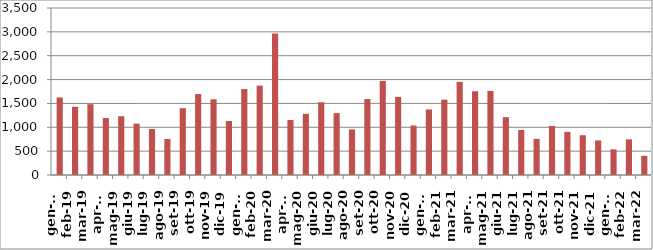
| Category | Series 0 |
|---|---|
| 2019-01-01 | 1625 |
| 2019-02-01 | 1430 |
| 2019-03-01 | 1484 |
| 2019-04-01 | 1196 |
| 2019-05-01 | 1232 |
| 2019-06-01 | 1076 |
| 2019-07-01 | 963 |
| 2019-08-01 | 755 |
| 2019-09-01 | 1400 |
| 2019-10-01 | 1697 |
| 2019-11-01 | 1587 |
| 2019-12-01 | 1131 |
| 2020-01-01 | 1801 |
| 2020-02-01 | 1874 |
| 2020-03-01 | 2963 |
| 2020-04-01 | 1154 |
| 2020-05-01 | 1282 |
| 2020-06-01 | 1525 |
| 2020-07-01 | 1297 |
| 2020-08-01 | 955 |
| 2020-09-01 | 1592 |
| 2020-10-01 | 1971 |
| 2020-11-01 | 1637 |
| 2020-12-01 | 1038 |
| 2021-01-01 | 1373 |
| 2021-02-01 | 1579 |
| 2021-03-01 | 1951 |
| 2021-04-01 | 1754 |
| 2021-05-01 | 1762 |
| 2021-06-01 | 1212 |
| 2021-07-01 | 943 |
| 2021-08-01 | 757 |
| 2021-09-01 | 1028 |
| 2021-10-01 | 904 |
| 2021-11-01 | 834 |
| 2021-12-01 | 725 |
| 2022-01-01 | 537 |
| 2022-02-01 | 746 |
| 2022-03-01 | 402 |